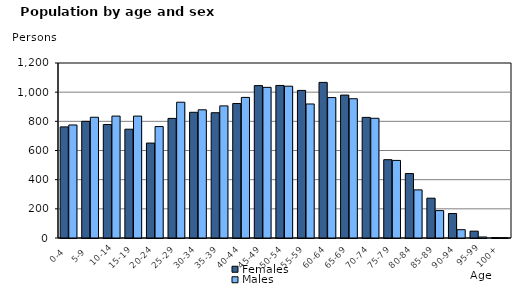
| Category | Females | Males |
|---|---|---|
|   0-4  | 762 | 775 |
|   5-9  | 800 | 828 |
| 10-14 | 778 | 836 |
| 15-19  | 746 | 836 |
| 20-24  | 651 | 764 |
| 25-29  | 820 | 931 |
| 30-34  | 862 | 879 |
| 35-39  | 859 | 906 |
| 40-44  | 922 | 964 |
| 45-49  | 1045 | 1033 |
| 50-54  | 1046 | 1041 |
| 55-59  | 1012 | 919 |
| 60-64  | 1067 | 963 |
| 65-69  | 980 | 955 |
| 70-74  | 827 | 821 |
| 75-79  | 537 | 532 |
| 80-84  | 442 | 330 |
| 85-89  | 273 | 188 |
| 90-94  | 168 | 57 |
| 95-99 | 47 | 7 |
| 100+ | 3 | 2 |